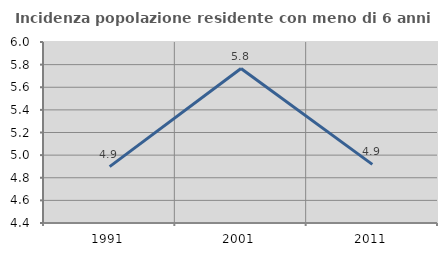
| Category | Incidenza popolazione residente con meno di 6 anni |
|---|---|
| 1991.0 | 4.898 |
| 2001.0 | 5.766 |
| 2011.0 | 4.918 |